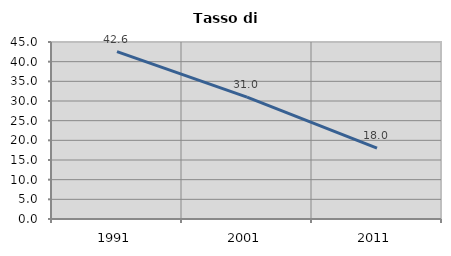
| Category | Tasso di disoccupazione   |
|---|---|
| 1991.0 | 42.572 |
| 2001.0 | 30.999 |
| 2011.0 | 18.008 |